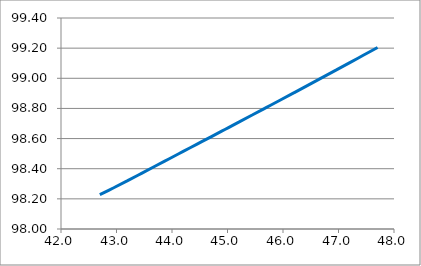
| Category | Series 0 |
|---|---|
| 42.6995 | 98.228 |
| 42.9503 | 98.274 |
| 43.2007 | 98.321 |
| 43.4511 | 98.369 |
| 43.7014 | 98.418 |
| 43.9517 | 98.466 |
| 44.202 | 98.515 |
| 44.4523 | 98.563 |
| 44.7026 | 98.612 |
| 44.9529 | 98.66 |
| 45.2031 | 98.709 |
| 45.4534 | 98.758 |
| 45.7036 | 98.807 |
| 45.9537 | 98.856 |
| 46.2039 | 98.905 |
| 46.454 | 98.955 |
| 46.7041 | 99.004 |
| 46.9541 | 99.054 |
| 47.2041 | 99.104 |
| 47.4541 | 99.154 |
| 47.704 | 99.204 |